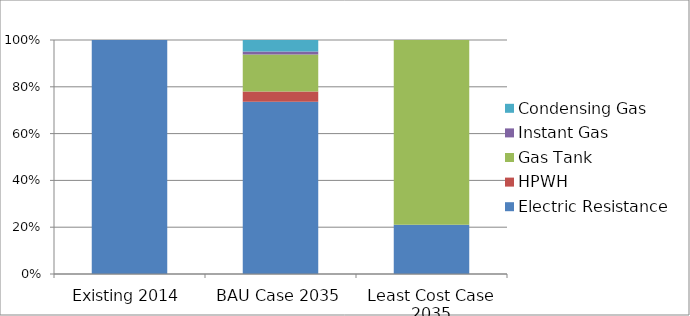
| Category | Electric Resistance | HPWH | Gas Tank | Instant Gas | Condensing Gas |
|---|---|---|---|---|---|
| Existing 2014 | 1 | 0 | 0 | 0 | 0 |
| BAU Case 2035 | 0.736 | 0.044 | 0.159 | 0.013 | 0.049 |
| Least Cost Case 2035 | 0.211 | 0 | 0.789 | 0 | 0 |